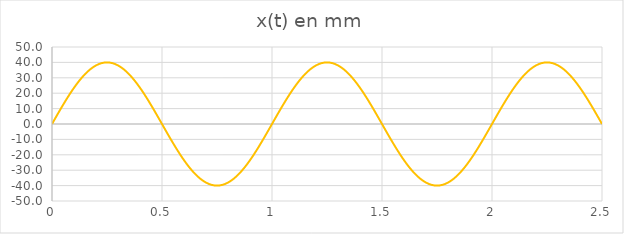
| Category | x(t) en mm |
|---|---|
| 0.0 | 0 |
| 0.025 | 6.257 |
| 0.05 | 12.361 |
| 0.075 | 18.16 |
| 0.1 | 23.511 |
| 0.125 | 28.284 |
| 0.15 | 32.361 |
| 0.175 | 35.64 |
| 0.2 | 38.042 |
| 0.225 | 39.508 |
| 0.25 | 40 |
| 0.275 | 39.508 |
| 0.3 | 38.042 |
| 0.325 | 35.64 |
| 0.35 | 32.361 |
| 0.375 | 28.284 |
| 0.4 | 23.511 |
| 0.425 | 18.16 |
| 0.45 | 12.361 |
| 0.475 | 6.257 |
| 0.5 | 0 |
| 0.525 | -6.257 |
| 0.55 | -12.361 |
| 0.575 | -18.16 |
| 0.6 | -23.511 |
| 0.625 | -28.284 |
| 0.65 | -32.361 |
| 0.675 | -35.64 |
| 0.7 | -38.042 |
| 0.725 | -39.508 |
| 0.75 | -40 |
| 0.775 | -39.508 |
| 0.8 | -38.042 |
| 0.825 | -35.64 |
| 0.85 | -32.361 |
| 0.875 | -28.284 |
| 0.9 | -23.511 |
| 0.925 | -18.16 |
| 0.95 | -12.361 |
| 0.975 | -6.257 |
| 1.0 | 0 |
| 1.025 | 6.257 |
| 1.05 | 12.361 |
| 1.075 | 18.16 |
| 1.1 | 23.511 |
| 1.125 | 28.284 |
| 1.15 | 32.361 |
| 1.175 | 35.64 |
| 1.2 | 38.042 |
| 1.225 | 39.508 |
| 1.25 | 40 |
| 1.275 | 39.508 |
| 1.3 | 38.042 |
| 1.325 | 35.64 |
| 1.35 | 32.361 |
| 1.375 | 28.284 |
| 1.4 | 23.511 |
| 1.425 | 18.16 |
| 1.45 | 12.361 |
| 1.475 | 6.257 |
| 1.5 | 0 |
| 1.525 | -6.257 |
| 1.55 | -12.361 |
| 1.575 | -18.16 |
| 1.6 | -23.511 |
| 1.625 | -28.284 |
| 1.65 | -32.361 |
| 1.675 | -35.64 |
| 1.7 | -38.042 |
| 1.725 | -39.508 |
| 1.75 | -40 |
| 1.775 | -39.508 |
| 1.8 | -38.042 |
| 1.825 | -35.64 |
| 1.85 | -32.361 |
| 1.875 | -28.284 |
| 1.9 | -23.511 |
| 1.925 | -18.16 |
| 1.95 | -12.361 |
| 1.975 | -6.257 |
| 2.0 | 0 |
| 2.025 | 6.257 |
| 2.05 | 12.361 |
| 2.075 | 18.16 |
| 2.1 | 23.511 |
| 2.125 | 28.284 |
| 2.15 | 32.361 |
| 2.175 | 35.64 |
| 2.2 | 38.042 |
| 2.225 | 39.508 |
| 2.25 | 40 |
| 2.275 | 39.508 |
| 2.3 | 38.042 |
| 2.325 | 35.64 |
| 2.35 | 32.361 |
| 2.375 | 28.284 |
| 2.4 | 23.511 |
| 2.425 | 18.16 |
| 2.45 | 12.361 |
| 2.475 | 6.257 |
| 2.5 | 0 |